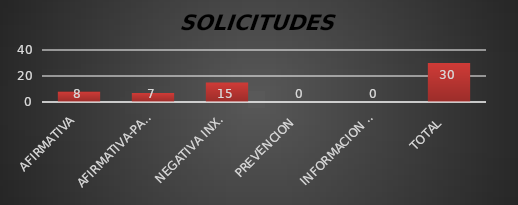
| Category | Series 1 |
|---|---|
| AFIRMATIVA | 8 |
| AFIRMATIVA-PARCIAL | 7 |
| NEGATIVA INX. | 15 |
| PREVENCION  | 0 |
| INFORMACION RESERVADA | 0 |
| TOTAL  | 30 |